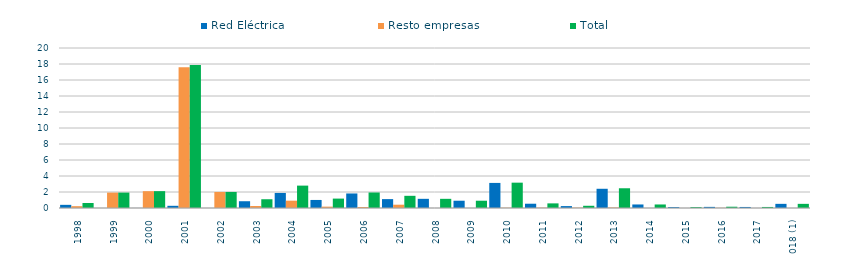
| Category | Red Eléctrica | Resto empresas | Total |
|---|---|---|---|
| 1998 | 0.395 | 0.227 | 0.622 |
| 1999 | 0.001 | 1.926 | 1.927 |
| 2000 | 0.004 | 2.103 | 2.107 |
| 2001 | 0.274 | 17.594 | 17.868 |
| 2002 | 0 | 2.006 | 2.006 |
| 2003 | 0.846 | 0.249 | 1.095 |
| 2004 | 1.882 | 0.916 | 2.798 |
| 2005 | 1.006 | 0.17 | 1.176 |
| 2006 | 1.817 | 0.122 | 1.939 |
| 2007 | 1.111 | 0.412 | 1.523 |
| 2008 | 1.147 | 0 | 1.147 |
| 2009 | 0.91 | 0 | 0.91 |
| 2010 | 3.135 | 0.032 | 3.167 |
| 2011 | 0.535 | 0.042 | 0.577 |
| 2012 | 0.238 | 0.04 | 0.278 |
| 2013 | 2.403 | 0.064 | 2.467 |
| 2014 | 0.441 | 0 | 0.441 |
| 2015 | 0.112 | 0 | 0.112 |
| 2016 | 0.14 | 0.02 | 0.16 |
| 2017 | 0.13 | 0 | 0.13 |
| 2018 (1) | 0.519 | 0 | 0.519 |